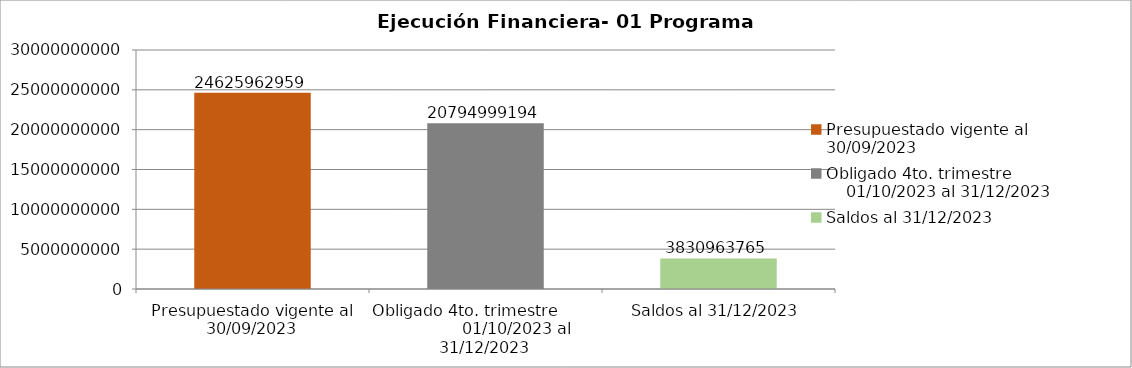
| Category | Presupuestado vigente al 30/09/2023 Obligado 4to. trimestre                      01/10/2023 al 31/12/2023 Saldos al 31/12/2023 |
|---|---|
| Presupuestado vigente al 30/09/2023 | 24625962959 |
| Obligado 4to. trimestre                      01/10/2023 al 31/12/2023 | 20794999194 |
| Saldos al 31/12/2023 | 3830963765 |